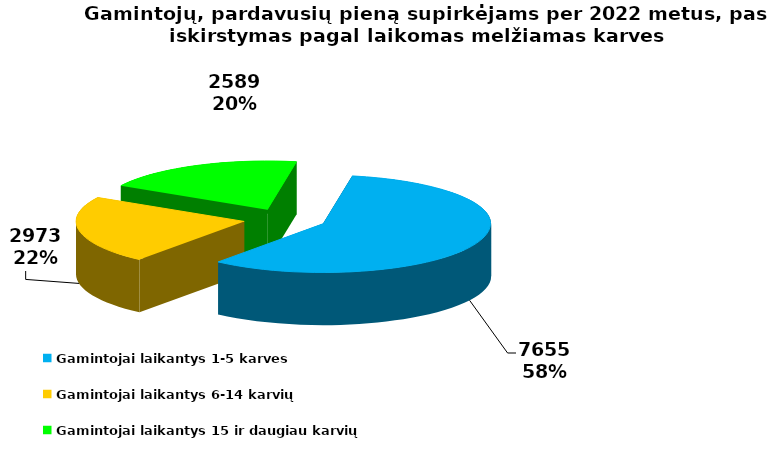
| Category | Gamintojų sk. |
|---|---|
| Gamintojai laikantys 1-5 karves | 7655 |
| Gamintojai laikantys 6-14 karvių | 2973 |
| Gamintojai laikantys 15 ir daugiau karvių | 2589 |